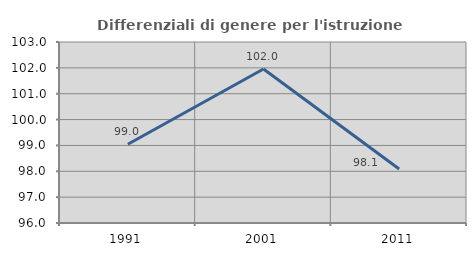
| Category | Differenziali di genere per l'istruzione superiore |
|---|---|
| 1991.0 | 99.046 |
| 2001.0 | 101.956 |
| 2011.0 | 98.086 |